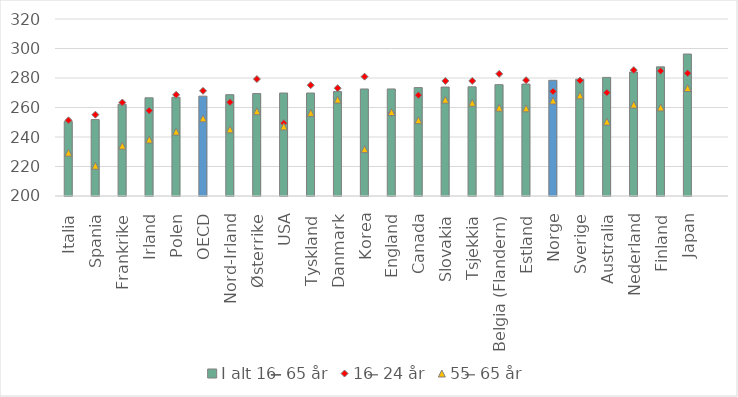
| Category | I alt 16 ̶̶ 65 år |
|---|---|
| Italia | 250.483 |
| Spania | 251.79 |
| Frankrike | 262.139 |
| Irland | 266.545 |
| Polen | 266.904 |
| OECD | 267.69 |
| Nord-Irland | 268.702 |
| Østerrike | 269.451 |
| USA | 269.806 |
| Tyskland | 269.808 |
| Danmark | 270.788 |
| Korea | 272.563 |
| England | 272.584 |
| Canada | 273.486 |
| Slovakia | 273.846 |
| Tsjekkia | 274.012 |
| Belgia (Flandern) | 275.48 |
| Estland | 275.884 |
| Norge | 278.425 |
| Sverige | 279.231 |
| Australia | 280.401 |
| Nederland | 284.007 |
| Finland | 287.546 |
| Japan | 296.242 |